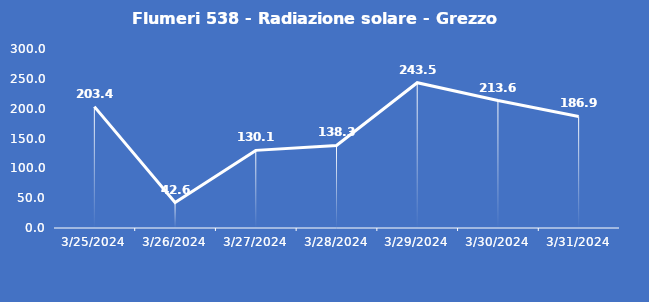
| Category | Flumeri 538 - Radiazione solare - Grezzo (W/m2) |
|---|---|
| 3/25/24 | 203.4 |
| 3/26/24 | 42.6 |
| 3/27/24 | 130.1 |
| 3/28/24 | 138.3 |
| 3/29/24 | 243.5 |
| 3/30/24 | 213.6 |
| 3/31/24 | 186.9 |